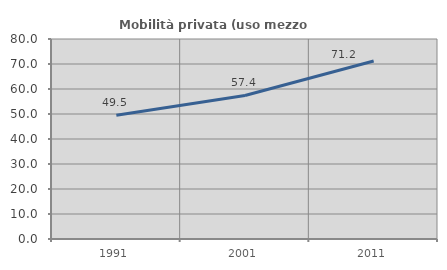
| Category | Mobilità privata (uso mezzo privato) |
|---|---|
| 1991.0 | 49.508 |
| 2001.0 | 57.409 |
| 2011.0 | 71.181 |